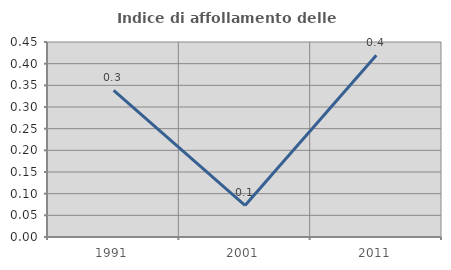
| Category | Indice di affollamento delle abitazioni  |
|---|---|
| 1991.0 | 0.338 |
| 2001.0 | 0.073 |
| 2011.0 | 0.42 |